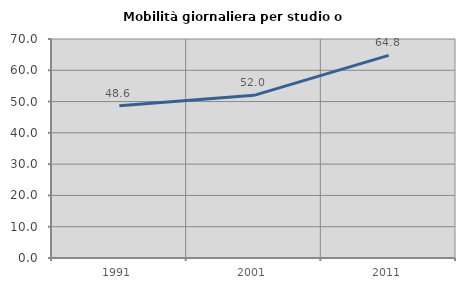
| Category | Mobilità giornaliera per studio o lavoro |
|---|---|
| 1991.0 | 48.636 |
| 2001.0 | 52 |
| 2011.0 | 64.773 |